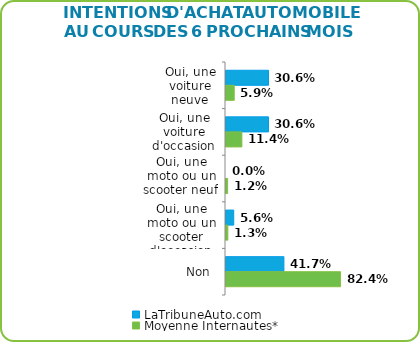
| Category | LaTribuneAuto.com | Moyenne Internautes* |
|---|---|---|
| Oui, une voiture neuve | 0.306 | 0.059 |
| Oui, une voiture d'occasion | 0.306 | 0.114 |
| Oui, une moto ou un scooter neuf | 0 | 0.012 |
| Oui, une moto ou un scooter d'occasion | 0.056 | 0.013 |
| Non  | 0.417 | 0.824 |